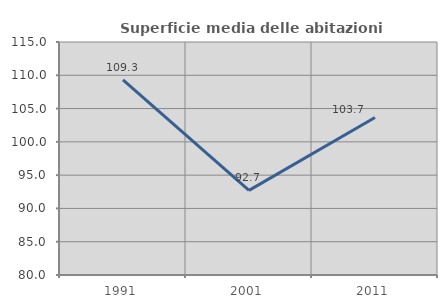
| Category | Superficie media delle abitazioni occupate |
|---|---|
| 1991.0 | 109.319 |
| 2001.0 | 92.707 |
| 2011.0 | 103.663 |